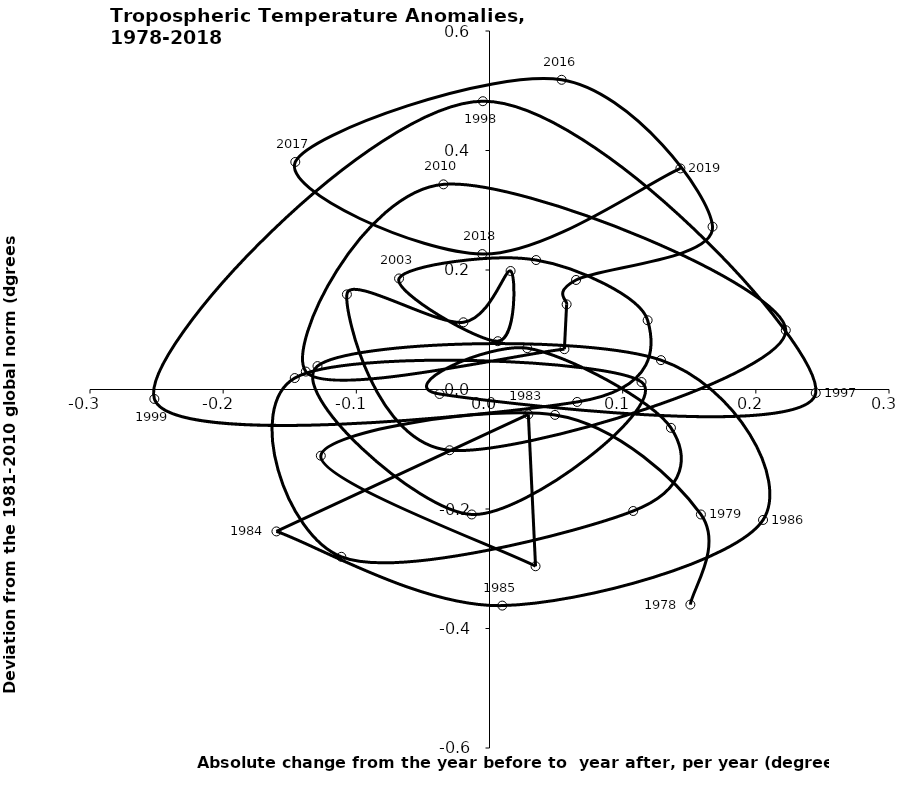
| Category | Series 0 |
|---|---|
| 0.15083333333333335 | -0.36 |
| 0.15875 | -0.209 |
| 0.04916666666666666 | -0.042 |
| -0.12666666666666668 | -0.111 |
| 0.03458333333333333 | -0.296 |
| 0.029166666666666688 | -0.042 |
| -0.15999999999999998 | -0.237 |
| 0.009583333333333333 | -0.362 |
| 0.20541666666666666 | -0.218 |
| 0.12874999999999998 | 0.049 |
| -0.12916666666666668 | 0.039 |
| -0.013333333333333329 | -0.209 |
| 0.11416666666666668 | 0.012 |
| -0.14625000000000005 | 0.019 |
| -0.11125000000000002 | -0.28 |
| 0.10791666666666672 | -0.203 |
| 0.13625 | -0.064 |
| 0.028333333333333332 | 0.069 |
| -0.037500000000000006 | -0.008 |
| 0.24500000000000005 | -0.006 |
| -0.004999999999999996 | 0.483 |
| -0.2516666666666667 | -0.016 |
| 0.06583333333333333 | -0.021 |
| 0.11875 | 0.116 |
| 0.035000000000000024 | 0.217 |
| -0.06791666666666665 | 0.186 |
| 0.006249999999999978 | 0.081 |
| 0.015833333333333324 | 0.198 |
| -0.019583333333333328 | 0.112 |
| -0.10708333333333334 | 0.159 |
| -0.030000000000000006 | -0.102 |
| 0.22249999999999998 | 0.099 |
| -0.034583333333333334 | 0.343 |
| -0.13791666666666663 | 0.03 |
| 0.056249999999999994 | 0.067 |
| 0.05791666666666668 | 0.142 |
| 0.06499999999999999 | 0.183 |
| 0.16750000000000004 | 0.272 |
| 0.054166666666666696 | 0.518 |
| -0.14583333333333337 | 0.381 |
| -0.005416666666666681 | 0.227 |
| 0.14333333333333334 | 0.37 |